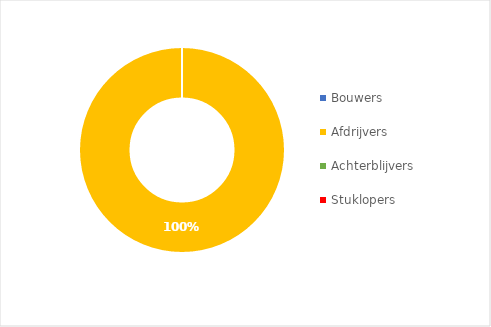
| Category | Series 0 |
|---|---|
| Bouwers | 0 |
| Afdrijvers | 1 |
| Achterblijvers | 0 |
| Stuklopers | 0 |